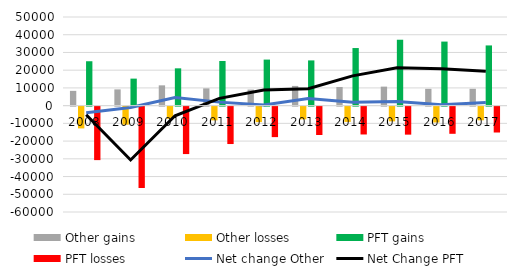
| Category | Other gains | Other losses | PFT gains | PFT losses |
|---|---|---|---|---|
| 2008.0 | 8329 | -12287 | 25044 | -30167 |
| 2009.0 | 9164 | -10201 | 15240 | -45892 |
| 2010.0 | 11443 | -6863 | 21042 | -26758 |
| 2011.0 | 9732 | -7753 | 25180 | -21097 |
| 2012.0 | 9054 | -8721 | 25978 | -17192 |
| 2013.0 | 11121 | -7166 | 25514 | -16013 |
| 2014.0 | 10526 | -8622 | 32489 | -15704 |
| 2015.0 | 10725 | -8324 | 37175 | -15800 |
| 2016.0 | 9479 | -8928 | 36131 | -15322 |
| 2017.0 | 9506 | -7710 | 33963 | -14594 |